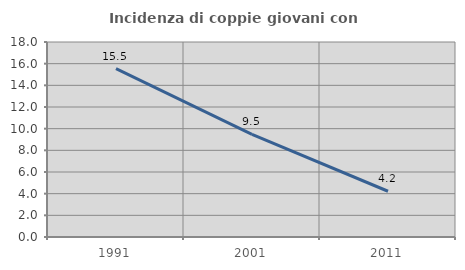
| Category | Incidenza di coppie giovani con figli |
|---|---|
| 1991.0 | 15.544 |
| 2001.0 | 9.479 |
| 2011.0 | 4.223 |